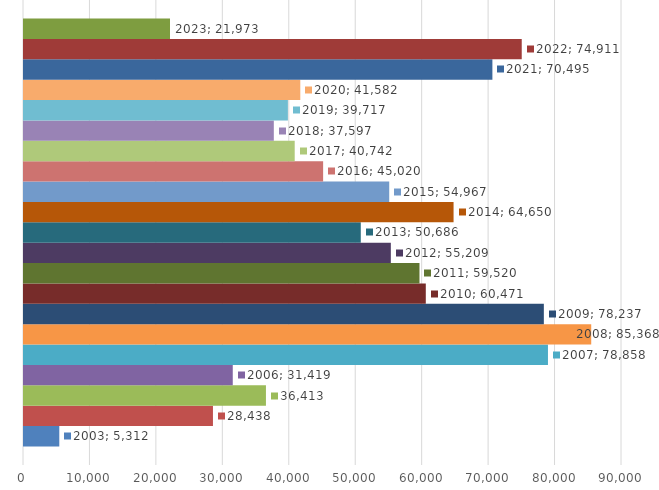
| Category | 2003 | 2004 | 2005 | 2006 | 2007 | 2008 | 2009 | 2010 | 2011 | 2012 | 2013 | 2014 | 2015 | 2016 | 2017 | 2018 | 2019 | 2020 | 2021 | 2022 | 2023 |
|---|---|---|---|---|---|---|---|---|---|---|---|---|---|---|---|---|---|---|---|---|---|
| 0 | 5312 | 28438 | 36413 | 31419 | 78858 | 85368 | 78237 | 60471 | 59520 | 55209 | 50686 | 64650 | 54967 | 45020 | 40742 | 37597 | 39717 | 41582 | 70495 | 74911 | 21973 |